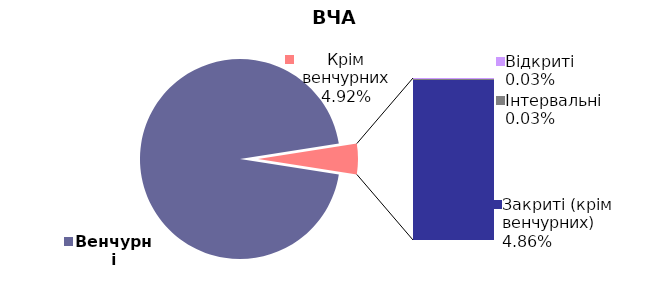
| Category | 30.09.2020 |
|---|---|
| Венчурні | 0.951 |
| Відкриті | 0 |
| Інтервальні | 0 |
| Закриті (крім венчурних) | 0.049 |